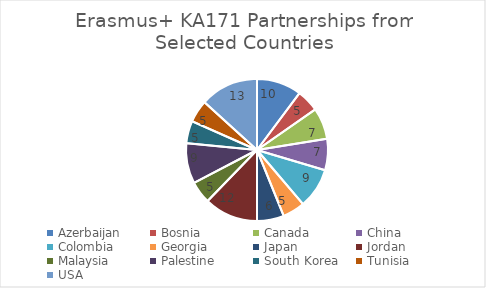
| Category | Number of Agreements |
|---|---|
| Azerbaijan | 10 |
| Bosnia | 5 |
| Canada | 7 |
| China | 7 |
| Colombia | 9 |
| Georgia | 5 |
| Japan | 6 |
| Jordan | 12 |
| Malaysia | 5 |
| Palestine | 9 |
| South Korea  | 5 |
| Tunisia | 5 |
| USA | 13 |